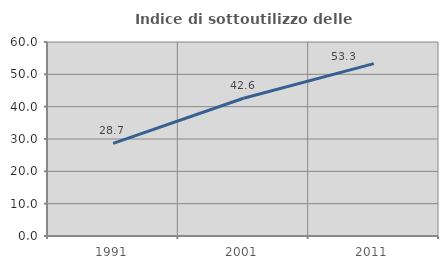
| Category | Indice di sottoutilizzo delle abitazioni  |
|---|---|
| 1991.0 | 28.652 |
| 2001.0 | 42.593 |
| 2011.0 | 53.304 |